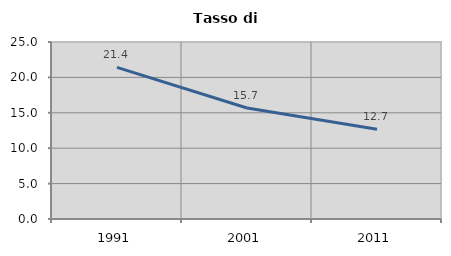
| Category | Tasso di disoccupazione   |
|---|---|
| 1991.0 | 21.423 |
| 2001.0 | 15.681 |
| 2011.0 | 12.677 |